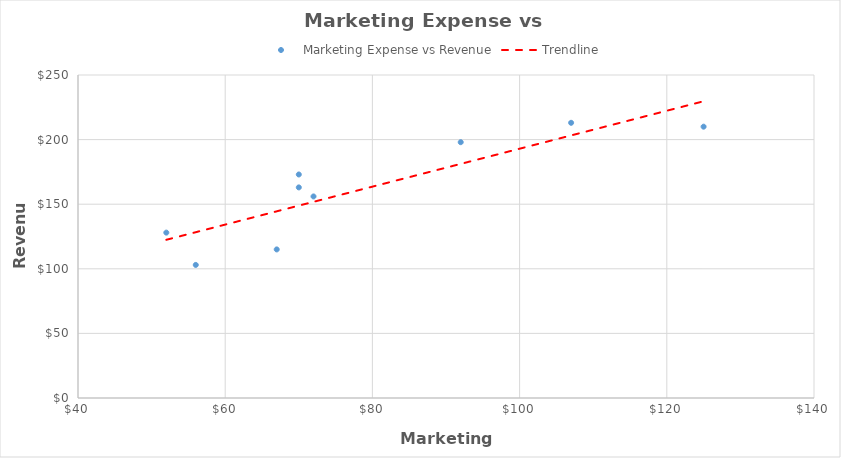
| Category | Marketing Expense vs Revenue |
|---|---|
| 56.0 | 103 |
| 67.0 | 115 |
| 72.0 | 156 |
| 70.0 | 173 |
| 107.0 | 213 |
| 125.0 | 210 |
| 92.0 | 198 |
| 70.0 | 163 |
| 52.0 | 128 |